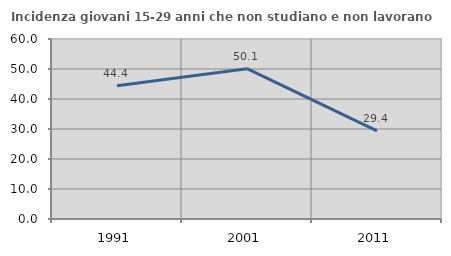
| Category | Incidenza giovani 15-29 anni che non studiano e non lavorano  |
|---|---|
| 1991.0 | 44.407 |
| 2001.0 | 50.095 |
| 2011.0 | 29.354 |